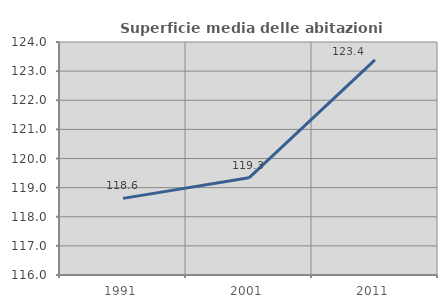
| Category | Superficie media delle abitazioni occupate |
|---|---|
| 1991.0 | 118.631 |
| 2001.0 | 119.337 |
| 2011.0 | 123.388 |